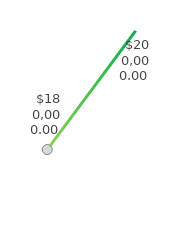
| Category | Series 0 |
|---|---|
| 0 | 180000 |
| 1 | 200000 |